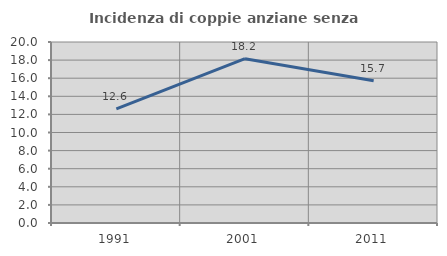
| Category | Incidenza di coppie anziane senza figli  |
|---|---|
| 1991.0 | 12.618 |
| 2001.0 | 18.154 |
| 2011.0 | 15.727 |